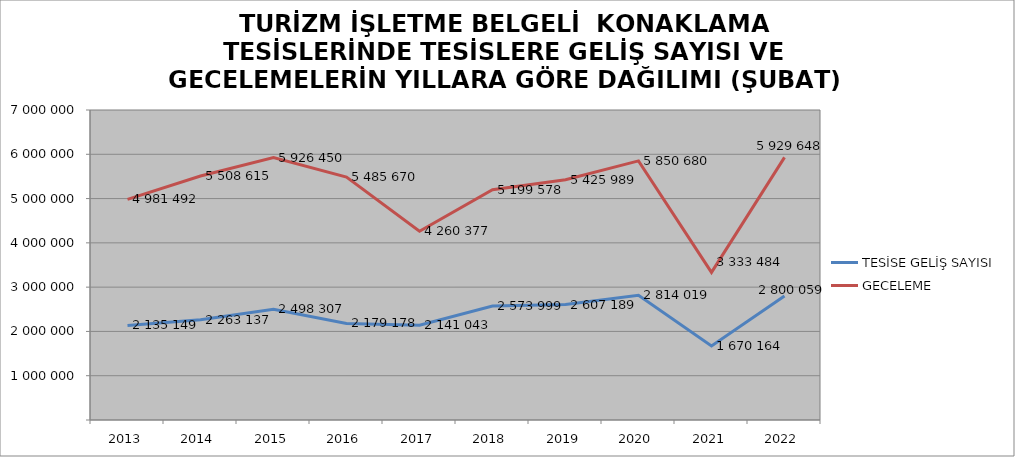
| Category | TESİSE GELİŞ SAYISI | GECELEME |
|---|---|---|
| 2013 | 2135149 | 4981492 |
| 2014 | 2263137 | 5508615 |
| 2015 | 2498307 | 5926450 |
| 2016 | 2179178 | 5485670 |
| 2017 | 2141043 | 4260377 |
| 2018 | 2573999 | 5199578 |
| 2019 | 2607189 | 5425989 |
| 2020 | 2814019 | 5850680 |
| 2021 | 1670164 | 3333484 |
| 2022 | 2800059 | 5929648 |